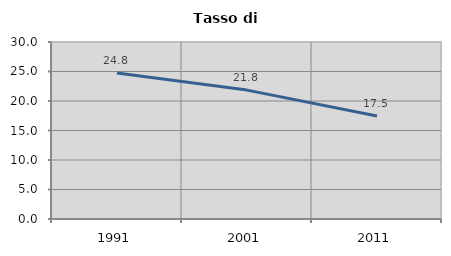
| Category | Tasso di disoccupazione   |
|---|---|
| 1991.0 | 24.762 |
| 2001.0 | 21.846 |
| 2011.0 | 17.47 |